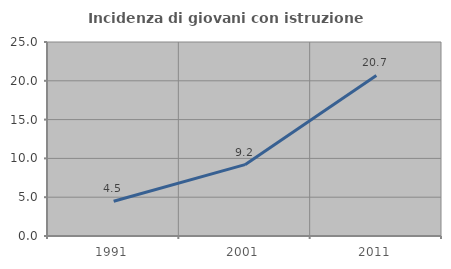
| Category | Incidenza di giovani con istruzione universitaria |
|---|---|
| 1991.0 | 4.47 |
| 2001.0 | 9.195 |
| 2011.0 | 20.69 |